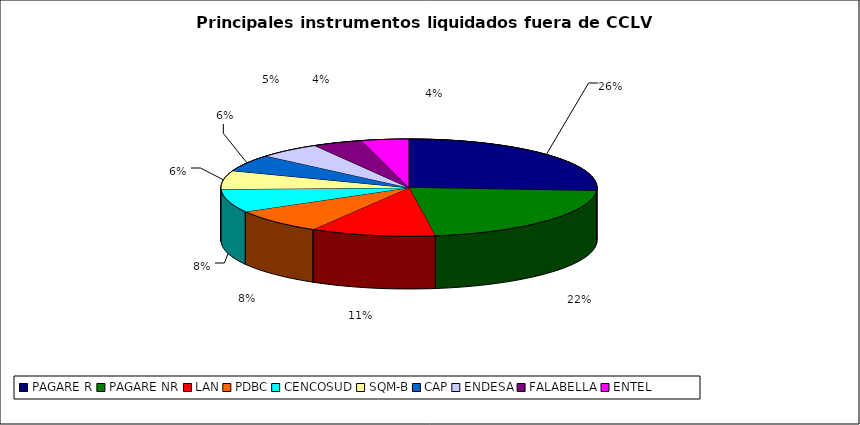
| Category | Series 0 |
|---|---|
| PAGARE R | 1853 |
| PAGARE NR | 1541 |
| LAN | 764 |
| PDBC | 589 |
| CENCOSUD | 546 |
| SQM-B | 438 |
| CAP | 401 |
| ENDESA | 380 |
| FALABELLA | 305 |
| ENTEL | 289 |